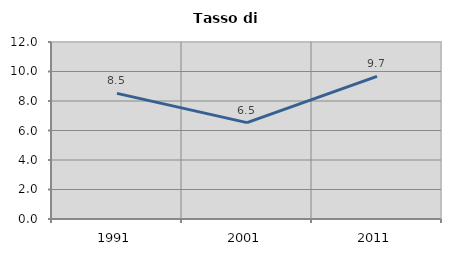
| Category | Tasso di disoccupazione   |
|---|---|
| 1991.0 | 8.515 |
| 2001.0 | 6.534 |
| 2011.0 | 9.669 |